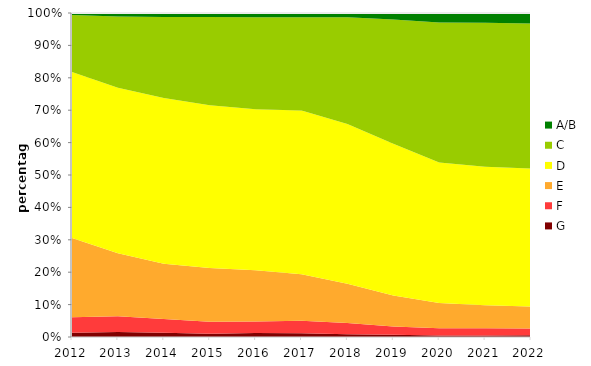
| Category | G | F | E | D | C | A/B |
|---|---|---|---|---|---|---|
| 2012.0 | 0.013 | 0.048 | 0.245 | 0.512 | 0.176 | 0.006 |
| 2013.0 | 0.015 | 0.049 | 0.194 | 0.511 | 0.22 | 0.011 |
| 2014.0 | 0.013 | 0.043 | 0.171 | 0.511 | 0.249 | 0.013 |
| 2015.0 | 0.01 | 0.037 | 0.166 | 0.503 | 0.272 | 0.012 |
| 2016.0 | 0.012 | 0.036 | 0.158 | 0.497 | 0.284 | 0.013 |
| 2017.0 | 0.012 | 0.038 | 0.144 | 0.505 | 0.288 | 0.013 |
| 2018.0 | 0.009 | 0.034 | 0.121 | 0.493 | 0.33 | 0.013 |
| 2019.0 | 0.007 | 0.025 | 0.096 | 0.469 | 0.383 | 0.02 |
| 2020.0 | 0.005 | 0.022 | 0.078 | 0.434 | 0.432 | 0.029 |
| 2021.0 | 0.005 | 0.022 | 0.071 | 0.427 | 0.445 | 0.03 |
| 2022.0 | 0.005 | 0.021 | 0.068 | 0.426 | 0.448 | 0.033 |